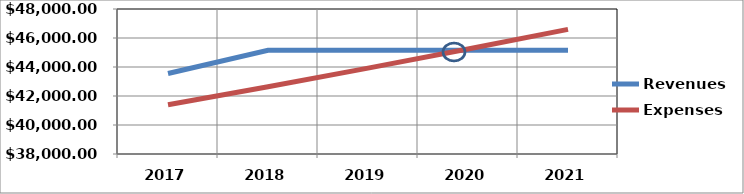
| Category | Revenues | Expenses |
|---|---|---|
| 2017.0 | 43550 | 41400 |
| 2018.0 | 45150 | 42642 |
| 2019.0 | 45150 | 43921 |
| 2020.0 | 45150 | 45239 |
| 2021.0 | 45150 | 46596 |